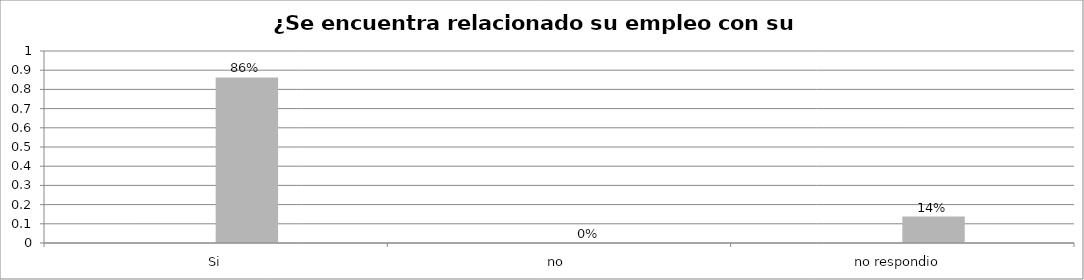
| Category | Series 0 | Series 1 | Series 2 | Series 3 |
|---|---|---|---|---|
| Si |  |  | 0.862 |  |
| no  |  |  | 0 |  |
| no respondio  |  |  | 0.138 |  |